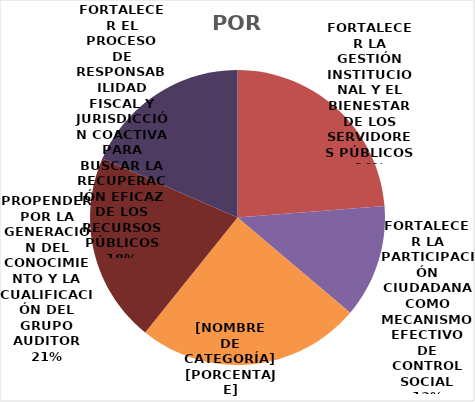
| Category | TOTAL 38,5% |
|---|---|
| FORTALECER LA GESTIÓN INSTITUCIONAL Y EL BIENESTAR DE LOS SERVIDORES PÚBLICOS | 0.457 |
| FORTALECER LA PARTICIPACIÓN CIUDADANA COMO MECANISMO EFECTIVO DE CONTROL SOCIAL | 0.239 |
| EJERCER LA VIGILANCIA Y CONTROL FISCAL DE LOS SUJETOS DE CONTROL, HACIENDO ÉNFASIS EN EL TEMA AMBIENTAL, DE FORMA CONFIABLE Y EFICAZ | 0.473 |
| PROPENDER POR LA GENERACIÓN DEL CONOCIMIENTO Y LA CUALIFICACIÓN DEL GRUPO AUDITOR | 0.4 |
| FORTALECER EL PROCESO DE RESPONSABILIDAD FISCAL Y JURISDICCIÓN COACTIVA PARA BUSCAR LA RECUPERACIÓN EFICAZ DE LOS RECURSOS PÚBLICOS | 0.355 |